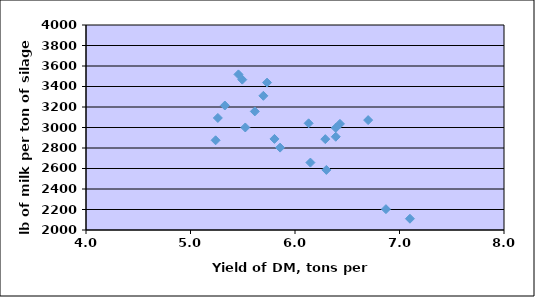
| Category | Series 0 |
|---|---|
| 3.98650506 | 3585 |
| 5.85741024 | 2803.75 |
| 6.29 | 2886.5 |
| 6.7 | 3072.25 |
| 6.39 | 2996 |
| 6.39 | 2909.75 |
| 5.24036085 | 2875.25 |
| 6.13065931 | 3040.75 |
| 5.4588527 | 3518 |
| 5.49551227 | 3467 |
| 6.43 | 3035.5 |
| 5.73278633 | 3438 |
| 5.26175071 | 3093.25 |
| 5.80351035 | 2888.5 |
| 6.87 | 2203.25 |
| 7.1 | 2110 |
| 5.52420056 | 3000.25 |
| 5.32865073 | 3214.5 |
| 5.69722025 | 3309 |
| 6.3 | 2586.25 |
| 5.61568785 | 3157 |
| 6.14753626 | 2657.75 |